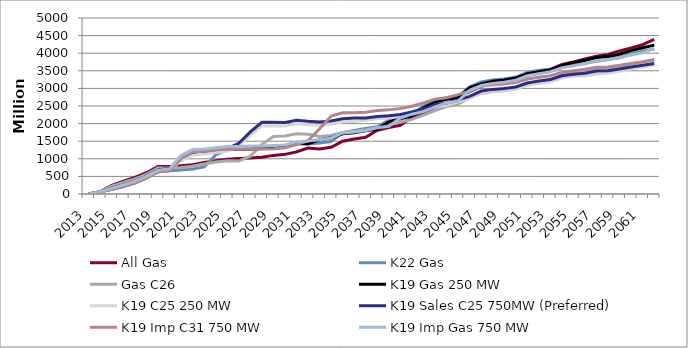
| Category | All Gas | K22 Gas | Gas C26 | K19 Gas 250 MW | K19 C25 250 MW | K19 Sales C25 750MW (Preferred) | K19 Imp C31 750 MW | K19 Imp Gas 750 MW |
|---|---|---|---|---|---|---|---|---|
| 2013.0 | 0 | 0 | 0 | 0 | 0 | 0 | 0 | 0 |
| 2014.0 | 66 | 66 | 67 | 66 | 65 | 66 | 66 | 66 |
| 2015.0 | 245 | 140 | 221 | 163 | 133 | 135 | 135 | 164 |
| 2016.0 | 368 | 228 | 326 | 259 | 213 | 214 | 214 | 259 |
| 2017.0 | 473 | 326 | 427 | 363 | 314 | 315 | 315 | 363 |
| 2018.0 | 605 | 477 | 556 | 502 | 457 | 458 | 450 | 502 |
| 2019.0 | 780 | 653 | 737 | 680 | 635 | 634 | 624 | 678 |
| 2020.0 | 783 | 658 | 740 | 724 | 674 | 672 | 660 | 718 |
| 2021.0 | 803 | 682 | 752 | 1008 | 947 | 1025 | 1031 | 1095 |
| 2022.0 | 829 | 711 | 786 | 1155 | 1106 | 1196 | 1197 | 1263 |
| 2023.0 | 893 | 769 | 853 | 1173 | 1135 | 1224 | 1211 | 1281 |
| 2024.0 | 946 | 1108 | 910 | 1206 | 1177 | 1261 | 1248 | 1316 |
| 2025.0 | 984 | 1272 | 947 | 1265 | 1214 | 1292 | 1275 | 1346 |
| 2026.0 | 1012 | 1277 | 937 | 1273 | 1353 | 1442 | 1271 | 1351 |
| 2027.0 | 1023 | 1281 | 1076 | 1278 | 1669 | 1765 | 1277 | 1363 |
| 2028.0 | 1045 | 1289 | 1405 | 1291 | 1934 | 2037 | 1277 | 1367 |
| 2029.0 | 1097 | 1292 | 1636 | 1298 | 1937 | 2038 | 1286 | 1378 |
| 2030.0 | 1126 | 1329 | 1645 | 1352 | 1929 | 2032 | 1310 | 1393 |
| 2031.0 | 1197 | 1421 | 1710 | 1442 | 1995 | 2093 | 1404 | 1480 |
| 2032.0 | 1308 | 1422 | 1695 | 1427 | 1970 | 2065 | 1517 | 1507 |
| 2033.0 | 1276 | 1447 | 1634 | 1538 | 1953 | 2046 | 1854 | 1540 |
| 2034.0 | 1329 | 1493 | 1663 | 1597 | 1981 | 2076 | 2212 | 1591 |
| 2035.0 | 1499 | 1740 | 1745 | 1711 | 2048 | 2138 | 2306 | 1734 |
| 2036.0 | 1564 | 1806 | 1786 | 1742 | 2070 | 2158 | 2305 | 1760 |
| 2037.0 | 1612 | 1862 | 1823 | 1793 | 2097 | 2157 | 2325 | 1806 |
| 2038.0 | 1810 | 1908 | 1886 | 1845 | 2142 | 2200 | 2372 | 1880 |
| 2039.0 | 1891 | 2100 | 1974 | 2048 | 2162 | 2221 | 2390 | 1922 |
| 2040.0 | 1953 | 2186 | 2037 | 2136 | 2205 | 2261 | 2427 | 2160 |
| 2041.0 | 2177 | 2267 | 2120 | 2220 | 2321 | 2330 | 2491 | 2268 |
| 2042.0 | 2303 | 2490 | 2239 | 2448 | 2371 | 2425 | 2584 | 2339 |
| 2043.0 | 2460 | 2653 | 2370 | 2610 | 2474 | 2537 | 2692 | 2474 |
| 2044.0 | 2530 | 2734 | 2483 | 2692 | 2522 | 2585 | 2737 | 2587 |
| 2045.0 | 2742 | 2771 | 2558 | 2734 | 2622 | 2674 | 2823 | 2642 |
| 2046.0 | 2907 | 3037 | 2730 | 3026 | 2716 | 2775 | 2923 | 2947 |
| 2047.0 | 3056 | 3182 | 2856 | 3127 | 2868 | 2925 | 3066 | 3083 |
| 2048.0 | 3154 | 3240 | 2914 | 3207 | 2917 | 2972 | 3103 | 3143 |
| 2049.0 | 3183 | 3270 | 2936 | 3241 | 2944 | 3000 | 3125 | 3178 |
| 2050.0 | 3239 | 3323 | 2987 | 3294 | 2985 | 3039 | 3165 | 3231 |
| 2051.0 | 3373 | 3450 | 3109 | 3417 | 3092 | 3154 | 3265 | 3358 |
| 2052.0 | 3449 | 3515 | 3169 | 3475 | 3141 | 3208 | 3315 | 3416 |
| 2053.0 | 3542 | 3543 | 3248 | 3530 | 3186 | 3255 | 3359 | 3474 |
| 2054.0 | 3681 | 3620 | 3376 | 3647 | 3294 | 3358 | 3456 | 3585 |
| 2055.0 | 3750 | 3664 | 3432 | 3738 | 3346 | 3405 | 3500 | 3640 |
| 2056.0 | 3835 | 3718 | 3475 | 3797 | 3355 | 3431 | 3542 | 3702 |
| 2057.0 | 3916 | 3771 | 3533 | 3880 | 3410 | 3491 | 3600 | 3784 |
| 2058.0 | 3967 | 3817 | 3570 | 3908 | 3431 | 3499 | 3610 | 3812 |
| 2059.0 | 4062 | 3875 | 3624 | 3971 | 3489 | 3549 | 3655 | 3872 |
| 2060.0 | 4152 | 3976 | 3689 | 4072 | 3555 | 3610 | 3711 | 3948 |
| 2061.0 | 4243 | 4055 | 3752 | 4157 | 3610 | 3656 | 3757 | 4009 |
| 2062.0 | 4391 | 4118 | 3816 | 4230 | 3660 | 3710 | 3815 | 4144 |